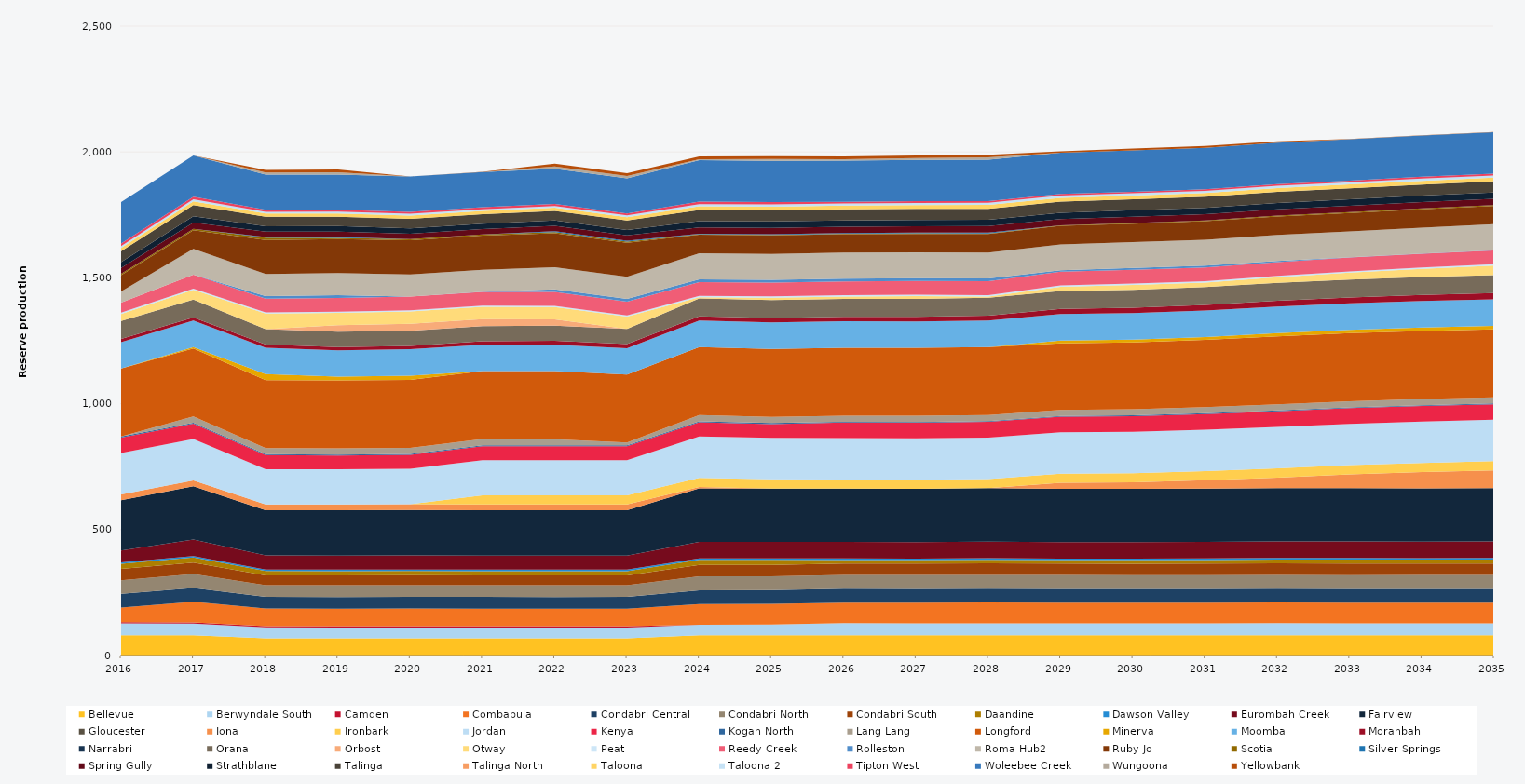
| Category | Bellevue | Berwyndale South | Camden | Combabula | Condabri Central | Condabri North | Condabri South | Daandine | Dawson Valley | Eurombah Creek | Fairview | Gloucester | Iona | Ironbark | Jordan | Kenya | Kogan North | Lang Lang | Longford | Minerva | Moomba | Moranbah | Narrabri | Orana | Orbost | Otway | Peat | Reedy Creek | Rolleston | Roma Hub2 | Ruby Jo | Scotia | Silver Springs | Spring Gully | Strathblane | Talinga | Talinga North | Taloona | Taloona 2 | Tipton West | Woleebee Creek | Wungoona | Yellowbank |
|---|---|---|---|---|---|---|---|---|---|---|---|---|---|---|---|---|---|---|---|---|---|---|---|---|---|---|---|---|---|---|---|---|---|---|---|---|---|---|---|---|---|---|---|
| 2016 | 80.52 | 46.928 | 5 | 57.862 | 54.302 | 54.44 | 44.9 | 20.13 | 5.856 | 47.02 | 199.531 | 0 | 23.12 | 0 | 164.7 | 60.89 | 4.392 | 0 | 270 | 0 | 105 | 12.859 | 0 | 70.856 | 0 | 27.952 | 5.49 | 39.633 | 0 | 45.014 | 64.114 | 6.013 | 0 | 22.674 | 23.544 | 43.236 | 0 | 13.294 | 7.472 | 9.516 | 164.7 | 0 | 0 |
| 2017 | 80.3 | 46.221 | 5 | 82.125 | 54.75 | 54.75 | 45.625 | 20.075 | 5.84 | 65.7 | 211.7 | 0 | 23.12 | 0 | 164.25 | 61.014 | 4.38 | 24.455 | 270 | 5.691 | 105 | 12.863 | 0 | 71.175 | 0 | 38 | 5.475 | 54.75 | 0 | 102.93 | 73.702 | 5.647 | 0 | 25.185 | 25.185 | 43.8 | 0 | 15.33 | 8.395 | 9.49 | 164.25 | 0 | 0 |
| 2018 | 68.255 | 43.435 | 5 | 69.806 | 46.538 | 46.538 | 38.781 | 17.064 | 5.84 | 55.845 | 179.945 | 0 | 23.12 | 0 | 139.612 | 55.845 | 3.723 | 24.455 | 270 | 23.725 | 105 | 13.029 | 0 | 60.499 | 0 | 61.725 | 4.654 | 54.75 | 10.356 | 87.49 | 135.663 | 8.592 | 3.143 | 21.407 | 21.407 | 37.23 | 0 | 13.031 | 7.136 | 8.066 | 139.612 | 7.956 | 10.43 |
| 2019 | 68.255 | 42.89 | 5 | 69.806 | 46.538 | 46.538 | 38.781 | 17.064 | 5.84 | 55.845 | 179.945 | 0 | 23.12 | 0 | 139.612 | 55.377 | 3.723 | 24.455 | 270 | 14.764 | 105 | 12.796 | 0 | 60.499 | 26.378 | 48.95 | 4.654 | 54.75 | 10.95 | 87.49 | 135.462 | 4.436 | 3.723 | 21.407 | 21.407 | 37.23 | 0 | 13.03 | 7.136 | 8.066 | 139.612 | 9.308 | 10.95 |
| 2020 | 68.442 | 42.901 | 5 | 69.998 | 46.665 | 46.665 | 38.887 | 17.111 | 5.856 | 55.998 | 180.438 | 0 | 23.12 | 0 | 139.995 | 55.625 | 3.733 | 24.522 | 270 | 16.571 | 105 | 12.768 | 0 | 60.664 | 27.45 | 48.95 | 4.666 | 54.9 | 0 | 87.73 | 135.727 | 4.598 | 0 | 21.466 | 21.466 | 37.332 | 0 | 13.066 | 7.155 | 8.089 | 139.995 | 0 | 0 |
| 2021 | 68.255 | 42.928 | 5 | 69.806 | 46.538 | 46.538 | 38.781 | 17.064 | 5.84 | 55.845 | 179.945 | 0 | 23.12 | 36.5 | 139.612 | 55.438 | 3.723 | 24.455 | 270 | 0 | 105 | 13.526 | 0 | 60.499 | 27.375 | 48.95 | 4.654 | 54.75 | 0.817 | 87.49 | 135.38 | 4.625 | 0 | 21.407 | 21.407 | 37.23 | 0 | 13.031 | 7.136 | 8.066 | 139.612 | 0 | 1.183 |
| 2022 | 68.255 | 42.905 | 5 | 69.806 | 46.538 | 46.538 | 38.781 | 17.064 | 5.84 | 55.845 | 179.945 | 0 | 23.12 | 36.5 | 139.612 | 55.448 | 3.723 | 24.455 | 270 | 0 | 105 | 15.305 | 0 | 60.499 | 25.279 | 48.95 | 4.654 | 54.75 | 10.95 | 87.49 | 135.293 | 4.276 | 3.723 | 21.407 | 21.407 | 37.23 | 0 | 13.031 | 7.136 | 8.066 | 139.612 | 9.308 | 10.95 |
| 2023 | 68.255 | 42.974 | 5 | 69.806 | 46.538 | 46.538 | 38.781 | 17.064 | 5.84 | 55.845 | 179.945 | 0 | 23.12 | 36.5 | 139.612 | 55.241 | 3.723 | 10.85 | 270 | 0 | 105 | 16.282 | 0 | 60.499 | 0 | 48.95 | 4.654 | 54.75 | 10.95 | 87.49 | 135.265 | 4.488 | 3.723 | 21.407 | 21.407 | 37.23 | 0 | 13.031 | 7.136 | 8.066 | 139.612 | 9.308 | 10.95 |
| 2024 | 80.52 | 41.234 | 0 | 82.35 | 54.9 | 54.9 | 45.75 | 20.13 | 5.856 | 65.88 | 212.28 | 0 | 5.3 | 36.6 | 164.7 | 55.766 | 4.392 | 24.522 | 270 | 0 | 105 | 16.806 | 0 | 71.37 | 0 | 4.689 | 5.49 | 54.9 | 10.98 | 103.212 | 73.713 | 1.875 | 1.763 | 25.254 | 25.254 | 43.92 | 0 | 15.372 | 8.418 | 9.516 | 164.7 | 4.126 | 10.98 |
| 2025 | 80.3 | 42.45 | 0 | 82.125 | 54.75 | 54.75 | 45.625 | 20.075 | 5.84 | 65.7 | 211.7 | 0 | 0 | 36.5 | 164.25 | 55.178 | 4.38 | 24.455 | 270 | 0 | 105 | 17.285 | 0 | 71.175 | 0 | 9.499 | 5.475 | 54.75 | 10.95 | 102.93 | 73.498 | 2.176 | 2.678 | 25.185 | 25.185 | 43.8 | 0 | 15.33 | 8.395 | 9.49 | 164.25 | 6.767 | 10.95 |
| 2026 | 80.3 | 47.839 | 0 | 82.125 | 54.75 | 54.75 | 45.625 | 14.07 | 5.84 | 65.7 | 211.7 | 0 | 0 | 36.5 | 164.25 | 61.66 | 2.857 | 24.455 | 270 | 0 | 105 | 17.534 | 0 | 71.175 | 0 | 9.804 | 5.475 | 54.75 | 10.95 | 102.93 | 73.455 | 2.074 | 2.272 | 25.185 | 25.185 | 43.8 | 0 | 15.33 | 8.395 | 5.948 | 164.25 | 5.517 | 10.95 |
| 2027 | 80.3 | 47.51 | 0 | 82.125 | 54.75 | 54.75 | 45.625 | 13.564 | 5.84 | 65.7 | 211.7 | 0 | 0 | 36.5 | 164.25 | 61.973 | 2.993 | 24.455 | 270 | 0 | 105 | 18.159 | 0 | 71.175 | 0 | 10.907 | 5.475 | 54.75 | 10.95 | 102.93 | 73.411 | 2.237 | 2.843 | 25.185 | 25.185 | 43.8 | 0 | 15.33 | 8.395 | 6.61 | 164.25 | 6.784 | 10.95 |
| 2028 | 80.52 | 47.498 | 0 | 82.35 | 54.9 | 54.9 | 45.75 | 14.478 | 5.856 | 65.88 | 212.28 | 0 | 0 | 36.6 | 164.7 | 62.28 | 2.883 | 24.522 | 270 | 0 | 105 | 19.008 | 0 | 71.37 | 0 | 5.28 | 5.49 | 54.9 | 10.98 | 103.212 | 73.537 | 2.346 | 3.621 | 25.254 | 25.254 | 43.92 | 0 | 15.372 | 8.418 | 6.153 | 164.7 | 8.957 | 10.98 |
| 2029 | 80.3 | 47.699 | 0 | 82.125 | 54.75 | 54.75 | 45.625 | 13.615 | 5.84 | 65.7 | 211.7 | 0 | 23.529 | 36.5 | 164.25 | 61.8 | 3.165 | 24.455 | 264.087 | 11.384 | 105 | 20.36 | 0 | 71.175 | 0 | 16.576 | 5.475 | 54.75 | 5.42 | 102.93 | 73.323 | 2.28 | 0.016 | 25.185 | 25.185 | 43.8 | 0 | 15.33 | 8.395 | 6.617 | 164.25 | 0.03 | 5.409 |
| 2030 | 80.3 | 47.08 | 0 | 82.125 | 54.75 | 54.75 | 45.625 | 14.331 | 5.84 | 65.7 | 211.7 | 0 | 25.355 | 36.5 | 164.25 | 62.42 | 3.008 | 24.455 | 264.931 | 11.948 | 105 | 21.622 | 0 | 71.175 | 0 | 18.77 | 5.475 | 54.75 | 7.107 | 102.93 | 73.279 | 2.663 | 0.012 | 25.185 | 25.185 | 43.8 | 0 | 15.33 | 8.395 | 6.305 | 164.25 | 0.03 | 7.136 |
| 2031 | 80.3 | 47.36 | 0 | 82.125 | 54.75 | 54.75 | 45.625 | 14.506 | 5.84 | 65.7 | 211.7 | 0 | 33.531 | 36.5 | 164.25 | 62.135 | 3.142 | 24.455 | 267.384 | 11.024 | 105 | 22.567 | 0 | 71.175 | 0 | 17.455 | 5.475 | 54.75 | 7.16 | 102.93 | 73.235 | 2.938 | 0 | 25.185 | 25.185 | 43.8 | 0 | 15.33 | 8.395 | 6.562 | 164.25 | 0 | 7.215 |
| 2032 | 80.52 | 47.62 | 0 | 82.35 | 54.9 | 54.9 | 45.75 | 15.122 | 5.856 | 65.88 | 212.28 | 0 | 41.436 | 36.6 | 164.7 | 62.169 | 3.177 | 24.522 | 270 | 12.793 | 105 | 23.484 | 0 | 71.37 | 0 | 21.596 | 5.49 | 54.9 | 4.871 | 103.212 | 73.361 | 3.208 | 0.017 | 25.254 | 25.254 | 43.92 | 0 | 15.372 | 8.418 | 7.012 | 164.7 | 0.015 | 5.103 |
| 2033 | 80.3 | 47.358 | 0 | 82.125 | 54.75 | 54.75 | 45.625 | 16.206 | 5.84 | 65.7 | 211.7 | 0 | 55.173 | 36.5 | 164.25 | 62.13 | 3.215 | 24.455 | 270 | 13.317 | 105 | 23.992 | 0 | 71.175 | 0 | 26.914 | 5.475 | 54.75 | 1.098 | 102.93 | 73.147 | 3.539 | 0.024 | 25.185 | 25.185 | 43.8 | 0 | 15.33 | 8.395 | 6.905 | 164.25 | 0.071 | 1.091 |
| 2034 | 80.3 | 47.611 | 0 | 82.125 | 54.75 | 54.75 | 45.625 | 15.711 | 5.84 | 65.7 | 211.7 | 0 | 64.267 | 36.5 | 164.25 | 61.88 | 3.308 | 24.455 | 270 | 14.173 | 105 | 24.563 | 0 | 71.175 | 0 | 31.619 | 5.475 | 54.75 | 0.73 | 102.93 | 73.103 | 3.726 | 0.084 | 25.185 | 25.185 | 43.8 | 0 | 15.33 | 8.395 | 7.491 | 164.25 | 0.172 | 0.665 |
| 2035 | 80.3 | 47.7 | 0 | 82.125 | 54.75 | 54.75 | 45.625 | 16.07 | 5.84 | 65.7 | 211.7 | 0 | 70.898 | 36.5 | 164.25 | 61.8 | 3.307 | 24.455 | 270 | 13.778 | 105 | 24.813 | 0 | 71.175 | 0 | 38.346 | 5.475 | 54.75 | 0.912 | 102.93 | 72.753 | 3.21 | 0.144 | 25.185 | 25.185 | 43.8 | 0 | 15.33 | 8.395 | 7.049 | 164.25 | 0.411 | 0.951 |